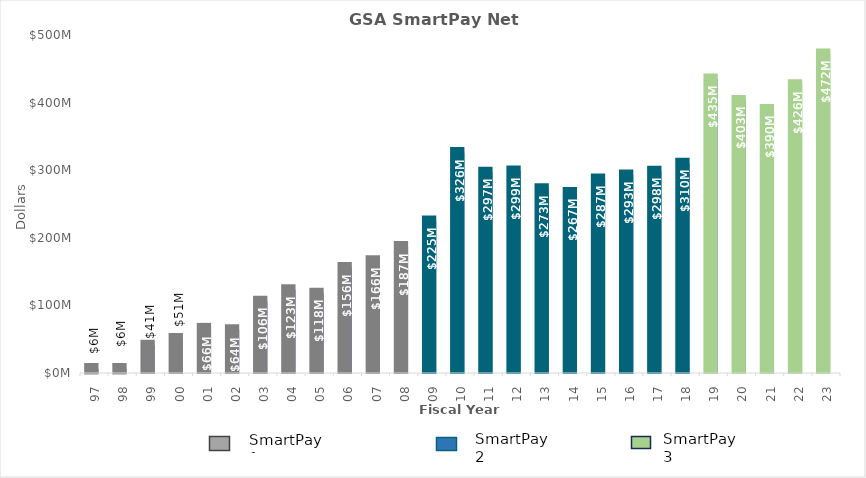
| Category | Refunds |
|---|---|
| 97 | 6000000 |
| 98 | 6000000 |
| 99 | 41000000 |
| 00 | 51000000 |
| 01 | 66000000 |
| 02 | 64000000 |
| 03 | 106000000 |
| 04 | 123000000 |
| 05 | 118000000 |
| 06 | 156000000 |
| 07 | 166000000 |
| 08 | 187000000 |
| 09 | 225000000 |
| 10 | 326000000 |
| 11 | 297000000 |
| 12 | 298837599.38 |
| 13 | 272580870.02 |
| 14 | 267128269.84 |
| 15 | 287102083.49 |
| 16 | 292814403.19 |
| 17 | 298445683.8 |
| 18 | 310243182.1 |
| 19 | 435057215.45 |
| 20 | 403244450.91 |
| 21 | 389812736.58 |
| 22 | 426467985.51 |
| 23 | 471856109.189 |